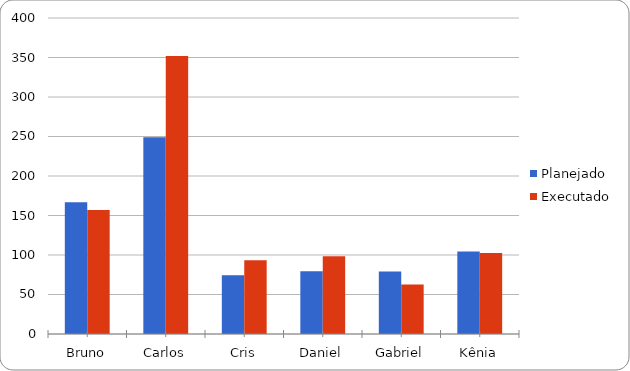
| Category | Planejado | Executado |
|---|---|---|
| Bruno | 166.83 | 156.83 |
| Carlos | 249 | 352 |
| Cris | 74.5 | 93.5 |
| Daniel | 79.5 | 98.5 |
| Gabriel | 79.16 | 62.6 |
| Kênia | 104.5 | 102.5 |